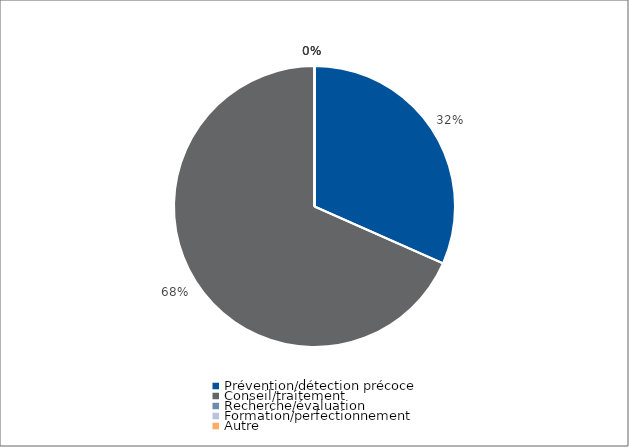
| Category | Series 0 |
|---|---|
| Prévention/détection précoce | 23066 |
| Conseil/traitement | 49866 |
| Recherche/évaluation | 0 |
| Formation/perfectionnement | 0 |
| Autre | 0 |